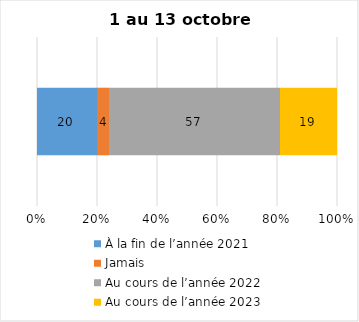
| Category | À la fin de l’année 2021 | Jamais | Au cours de l’année 2022 | Au cours de l’année 2023 |
|---|---|---|---|---|
| 0 | 20 | 4 | 57 | 19 |